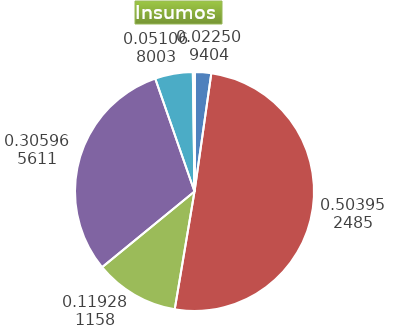
| Category | Series 0 |
|---|---|
| Control arvenses | 555876 |
| Control fitosanitario | 12445247 |
| Cosecha y beneficio | 2822205.026 |
| Fertilización | 7555906 |
| Instalación | 1261138.554 |
| Otros | 54906 |
| Podas | 0 |
| Riego | 0 |
| Transporte | 0 |
| Tutorado | 0 |